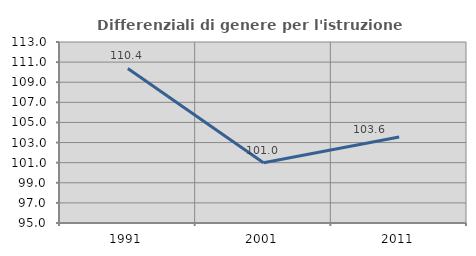
| Category | Differenziali di genere per l'istruzione superiore |
|---|---|
| 1991.0 | 110.368 |
| 2001.0 | 100.999 |
| 2011.0 | 103.557 |